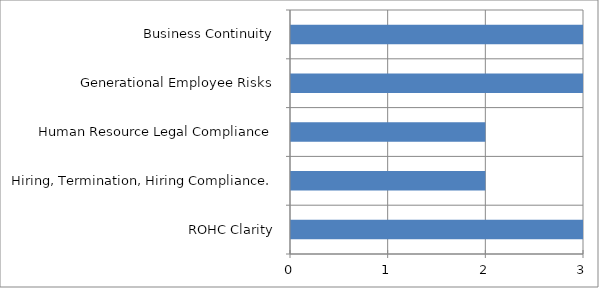
| Category | Series 0 |
|---|---|
| ROHC Clarity | 3 |
| Hiring, Termination, Hiring Compliance. | 2 |
| Human Resource Legal Compliance | 2 |
| Generational Employee Risks | 3 |
| Business Continuity | 3 |